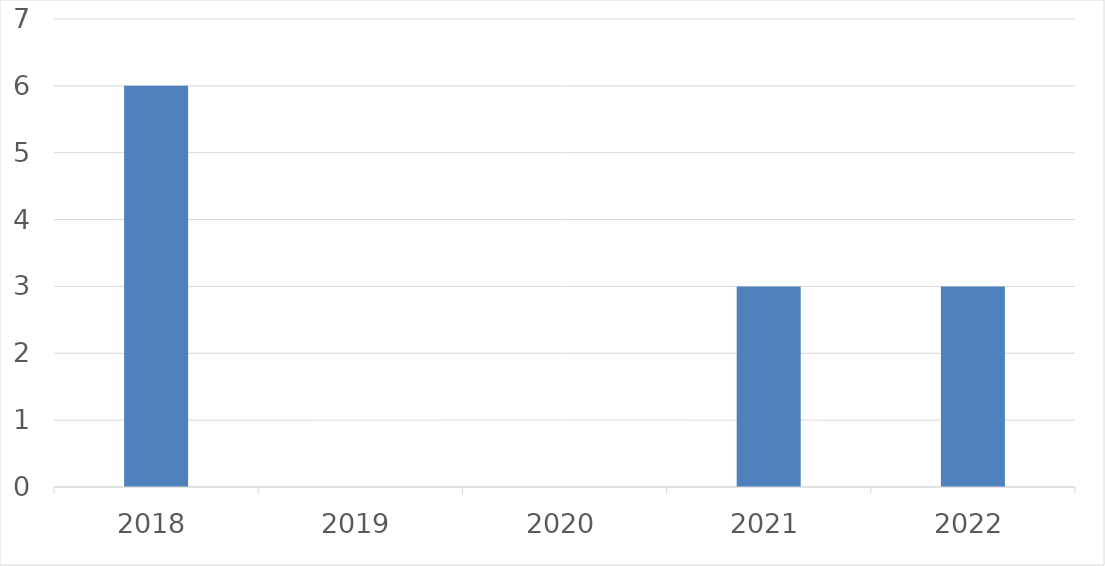
| Category | Series 0 |
|---|---|
| 2018 | 6 |
| 2019 | 0 |
| 2020 | 0 |
| 2021 | 3 |
| 2022 | 3 |